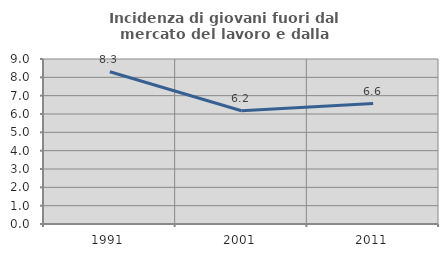
| Category | Incidenza di giovani fuori dal mercato del lavoro e dalla formazione  |
|---|---|
| 1991.0 | 8.306 |
| 2001.0 | 6.175 |
| 2011.0 | 6.571 |